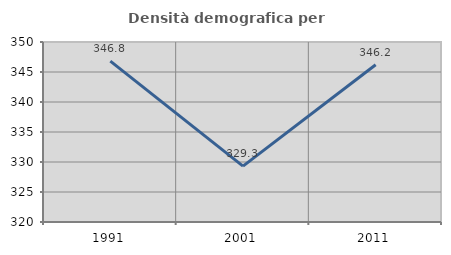
| Category | Densità demografica |
|---|---|
| 1991.0 | 346.822 |
| 2001.0 | 329.305 |
| 2011.0 | 346.21 |